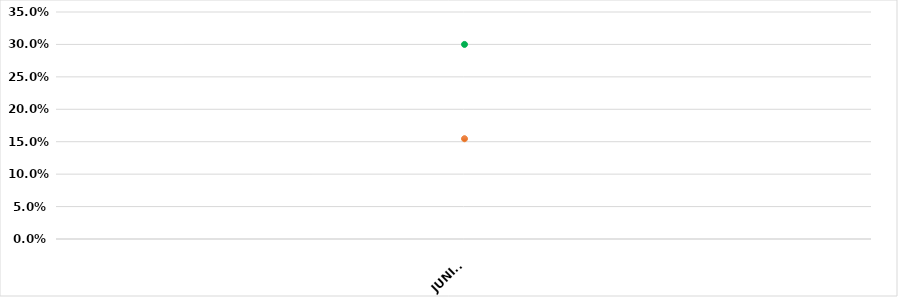
| Category | VALOR  | META PONDERADA |
|---|---|---|
| JUNIO | 0.155 | 0.3 |